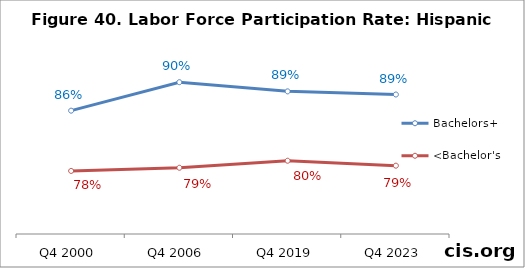
| Category | Bachelors+ | <Bachelor's |
|---|---|---|
| Q4 2000 | 0.865 | 0.784 |
| Q4 2006 | 0.903 | 0.789 |
| Q4 2019 | 0.891 | 0.798 |
| Q4 2023 | 0.886 | 0.791 |